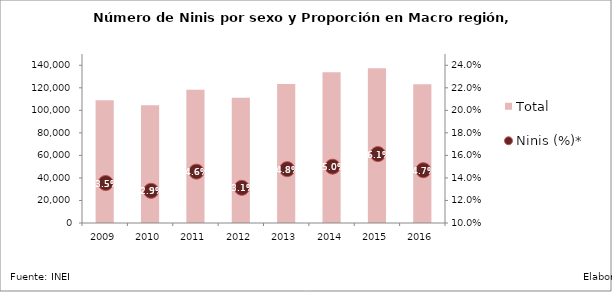
| Category | Total |
|---|---|
| 2009.0 | 108854.54 |
| 2010.0 | 104424.11 |
| 2011.0 | 118292.92 |
| 2012.0 | 111262.4 |
| 2013.0 | 123359.01 |
| 2014.0 | 133787.04 |
| 2015.0 | 137247.99 |
| 2016.0 | 123132.17 |